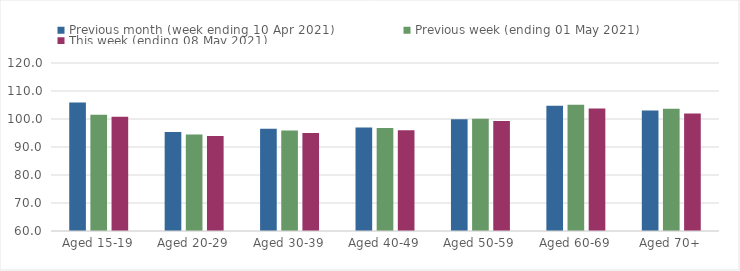
| Category | Previous month (week ending 10 Apr 2021) | Previous week (ending 01 May 2021) | This week (ending 08 May 2021) |
|---|---|---|---|
| Aged 15-19 | 105.91 | 101.56 | 100.83 |
| Aged 20-29 | 95.39 | 94.43 | 93.92 |
| Aged 30-39 | 96.49 | 95.89 | 95.01 |
| Aged 40-49 | 97 | 96.78 | 96.01 |
| Aged 50-59 | 99.89 | 100.08 | 99.28 |
| Aged 60-69 | 104.72 | 105.12 | 103.74 |
| Aged 70+ | 103.03 | 103.68 | 101.96 |